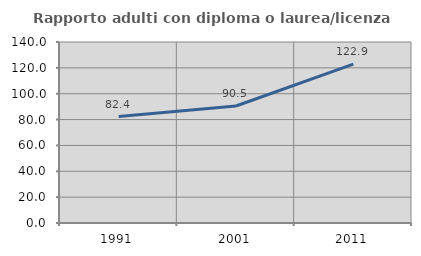
| Category | Rapporto adulti con diploma o laurea/licenza media  |
|---|---|
| 1991.0 | 82.353 |
| 2001.0 | 90.476 |
| 2011.0 | 122.857 |